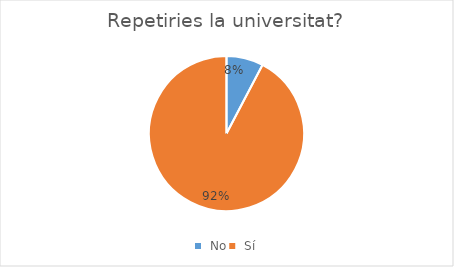
| Category | Series 0 |
|---|---|
|  No | 2 |
|  Sí | 24 |